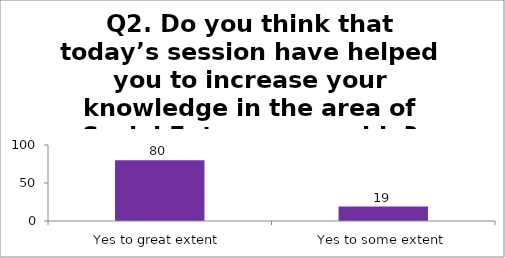
| Category | Q2. Do you think that today’s session have helped you to increase your knowledge in the area of Social Entrepreneurship? |
|---|---|
| Yes to great extent | 80 |
| Yes to some extent | 19 |